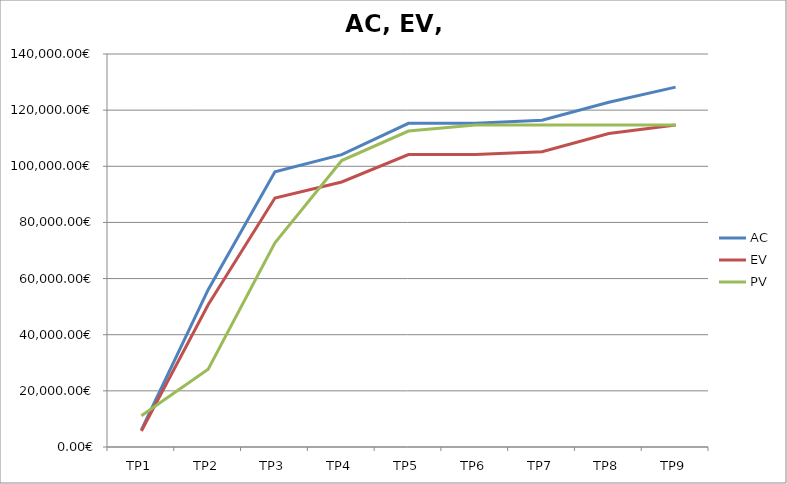
| Category | AC | EV | PV |
|---|---|---|---|
| TP1 | 6050 | 5700 | 11107.692 |
| TP2 | 56050 | 50700 | 27717.582 |
| TP3 | 98050 | 88700 | 72771.429 |
| TP4 | 104150 | 94400 | 102033.333 |
| TP5 | 115300 | 104200 | 112557.143 |
| TP6 | 115300 | 104200 | 114700 |
| TP7 | 116420 | 105200 | 114700 |
| TP8 | 122800 | 111700 | 114700 |
| TP9 | 128200 | 114700 | 114700 |